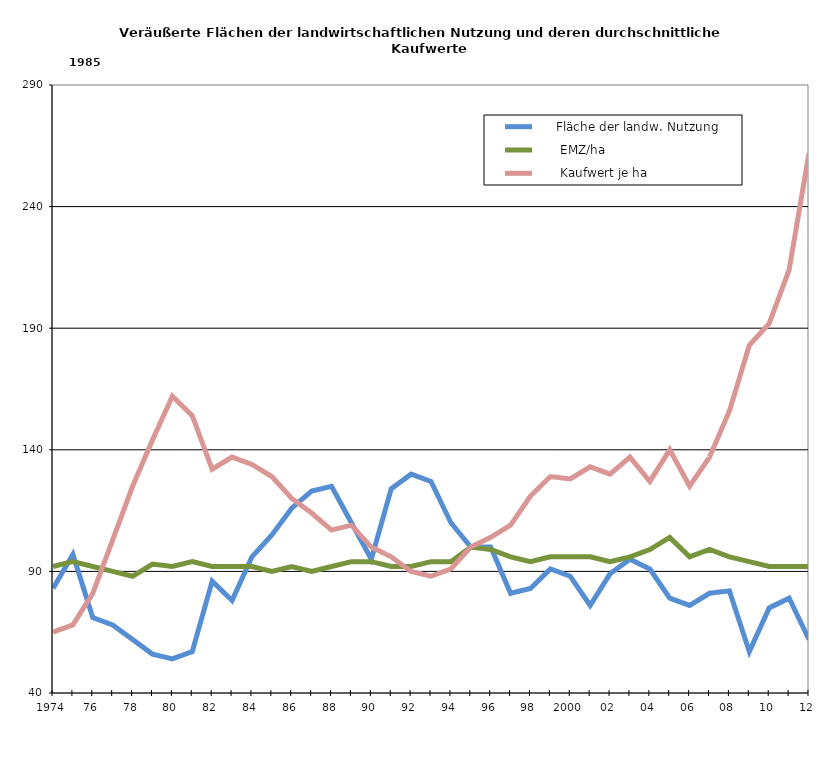
| Category |      Fläche der landw. Nutzung |       EMZ/ha |       Kaufwert je ha |
|---|---|---|---|
| 1974.0 | 83 | 92 | 65 |
| 75.0 | 97 | 94 | 68 |
| 76.0 | 71 | 92 | 81 |
| 77.0 | 68 | 90 | 103 |
| 78.0 | 62 | 88 | 125 |
| 79.0 | 56 | 93 | 144 |
| 80.0 | 54 | 92 | 162 |
| 81.0 | 57 | 94 | 154 |
| 82.0 | 86 | 92 | 132 |
| 83.0 | 78 | 92 | 137 |
| 84.0 | 96 | 92 | 134 |
| 85.0 | 105 | 90 | 129 |
| 86.0 | 116 | 92 | 120 |
| 87.0 | 123 | 90 | 114 |
| 88.0 | 125 | 92 | 107 |
| 89.0 | 110 | 94 | 109 |
| 90.0 | 95 | 94 | 100 |
| 91.0 | 124 | 92 | 96 |
| 92.0 | 130 | 92 | 90 |
| 93.0 | 127 | 94 | 88 |
| 94.0 | 110 | 94 | 91 |
| 95.0 | 100 | 100 | 100 |
| 96.0 | 100 | 99 | 104 |
| 97.0 | 81 | 96 | 109 |
| 98.0 | 83 | 94 | 121 |
| 99.0 | 91 | 96 | 129 |
| 2000.0 | 88 | 96 | 128 |
| 1.0 | 76 | 96 | 133 |
| 2.0 | 89 | 94 | 130 |
| 3.0 | 95 | 96 | 137 |
| 4.0 | 91 | 99 | 127 |
| 5.0 | 79 | 104 | 140 |
| 6.0 | 76 | 96 | 125 |
| 7.0 | 81 | 99 | 137 |
| 8.0 | 82 | 96 | 156 |
| 9.0 | 57 | 94 | 183 |
| 10.0 | 75 | 92 | 192 |
| 11.0 | 79 | 92 | 214 |
| 12.0 | 62 | 92 | 262 |